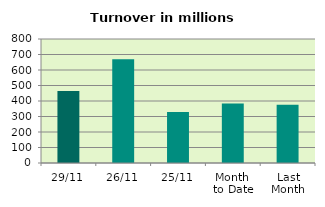
| Category | Series 0 |
|---|---|
| 29/11 | 463.759 |
| 26/11 | 669.126 |
| 25/11 | 329.087 |
| Month 
to Date | 383.494 |
| Last
Month | 375.959 |